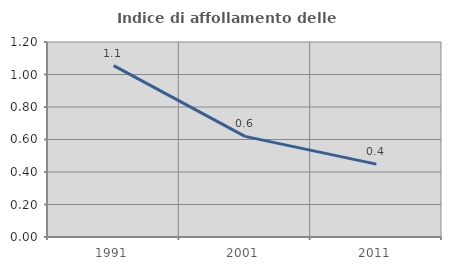
| Category | Indice di affollamento delle abitazioni  |
|---|---|
| 1991.0 | 1.054 |
| 2001.0 | 0.619 |
| 2011.0 | 0.448 |